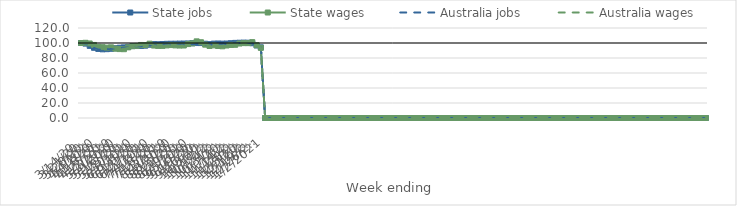
| Category | State jobs | State wages | Australia jobs | Australia wages |
|---|---|---|---|---|
| 14/03/2020 | 100 | 100 | 100 | 100 |
| 21/03/2020 | 99.199 | 100.272 | 99.218 | 99.669 |
| 28/03/2020 | 96.184 | 99.377 | 96.159 | 98.38 |
| 04/04/2020 | 93.62 | 97.412 | 93.511 | 96.663 |
| 11/04/2020 | 92.101 | 94.814 | 91.845 | 94.08 |
| 18/04/2020 | 91.582 | 94.457 | 91.454 | 93.993 |
| 25/04/2020 | 91.772 | 93.842 | 91.82 | 94.131 |
| 02/05/2020 | 92.268 | 94.226 | 92.24 | 94.625 |
| 09/05/2020 | 92.997 | 92.457 | 92.814 | 93.438 |
| 16/05/2020 | 93.733 | 91.882 | 93.355 | 92.628 |
| 23/05/2020 | 94.174 | 91.739 | 93.675 | 92.257 |
| 30/05/2020 | 94.816 | 94.202 | 94.182 | 93.555 |
| 06/06/2020 | 95.926 | 95.718 | 95.129 | 95.487 |
| 13/06/2020 | 95.938 | 96.122 | 95.64 | 96.179 |
| 20/06/2020 | 96.085 | 97.384 | 95.803 | 97.167 |
| 27/06/2020 | 96.443 | 97.262 | 95.768 | 97.377 |
| 04/07/2020 | 97.688 | 99.097 | 97.026 | 99.465 |
| 11/07/2020 | 98.485 | 96.6 | 97.722 | 96.839 |
| 18/07/2020 | 98.348 | 96.113 | 97.64 | 96.355 |
| 25/07/2020 | 98.619 | 96.131 | 97.768 | 96.035 |
| 01/08/2020 | 98.913 | 96.78 | 97.912 | 96.762 |
| 08/08/2020 | 98.986 | 97.249 | 97.848 | 97.159 |
| 15/08/2020 | 99.041 | 96.804 | 97.715 | 96.636 |
| 22/08/2020 | 99.156 | 96.598 | 97.726 | 96.439 |
| 29/08/2020 | 99.258 | 96.658 | 97.792 | 96.622 |
| 05/09/2020 | 99.377 | 98.542 | 97.988 | 99.323 |
| 12/09/2020 | 99.742 | 99.445 | 98.415 | 100.272 |
| 19/09/2020 | 99.925 | 102.189 | 98.579 | 101.043 |
| 26/09/2020 | 99.913 | 101.037 | 98.452 | 100.421 |
| 03/10/2020 | 99.016 | 97.783 | 97.813 | 98.297 |
| 10/10/2020 | 98.499 | 96.042 | 97.688 | 96.578 |
| 17/10/2020 | 99.168 | 96.836 | 98.252 | 97.02 |
| 24/10/2020 | 99.322 | 95.989 | 98.419 | 96.422 |
| 31/10/2020 | 99.142 | 95.599 | 98.499 | 96.422 |
| 07/11/2020 | 99.277 | 96.665 | 98.826 | 97.695 |
| 14/11/2020 | 99.713 | 97.358 | 99.425 | 98.506 |
| 21/11/2020 | 100.165 | 97.569 | 99.648 | 98.519 |
| 28/11/2020 | 100.336 | 99.274 | 99.873 | 99.566 |
| 05/12/2020 | 100.518 | 99.824 | 100.204 | 100.773 |
| 12/12/2020 | 100.385 | 99.806 | 100.228 | 101.122 |
| 19/12/2020 | 99.656 | 101.156 | 99.39 | 101.653 |
| 26/12/2020 | 96.724 | 97.083 | 96.352 | 97.474 |
| 02/01/2021 | 94.214 | 93.552 | 93.927 | 93.755 |